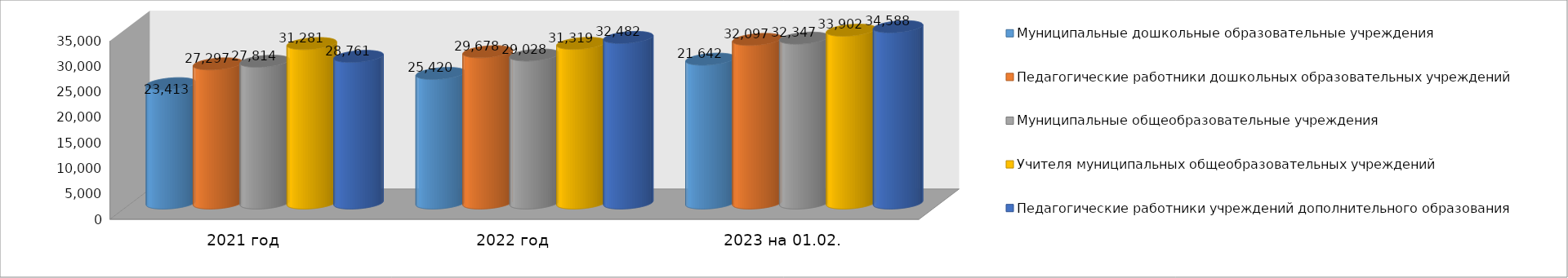
| Category | Муниципальные дошкольные образовательные учреждения | Педагогические работники дошкольных образовательных учреждений | Муниципальные общеобразовательные учреждения | Учителя муниципальных общеобразовательных учреждений | Педагогические работники учреждений дополнительного образования |
|---|---|---|---|---|---|
| 2021 год | 23413 | 27297 | 27814 | 31281 | 28761 |
| 2022 год | 25420 | 29678 | 29028 | 31319 | 32482 |
| 2023 на 01.02. | 28217 | 32097 | 32347 | 33902 | 34588 |